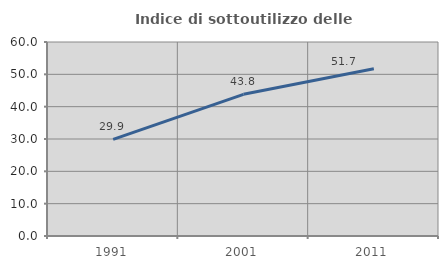
| Category | Indice di sottoutilizzo delle abitazioni  |
|---|---|
| 1991.0 | 29.883 |
| 2001.0 | 43.816 |
| 2011.0 | 51.701 |